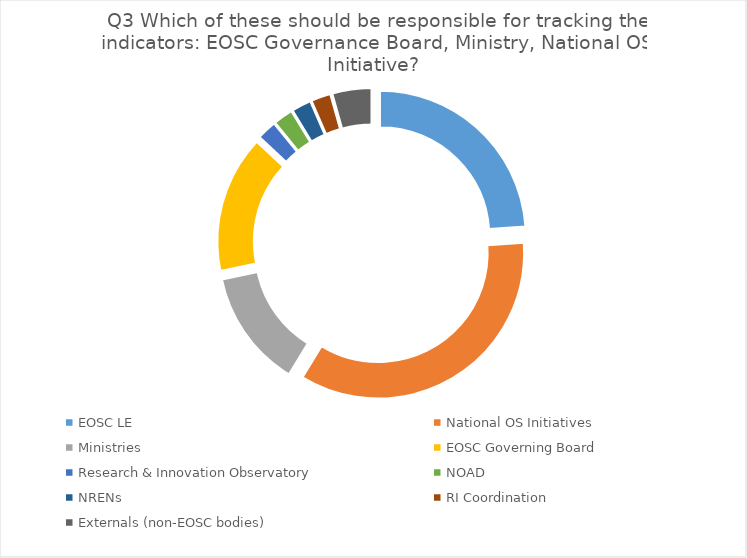
| Category | Series 0 |
|---|---|
| EOSC LE | 11 |
| National OS Initiatives | 16 |
| Ministries | 6 |
| EOSC Governing Board | 7 |
| Research & Innovation Observatory | 1 |
| NOAD | 1 |
| NRENs | 1 |
| RI Coordination | 1 |
| Externals (non-EOSC bodies) | 2 |